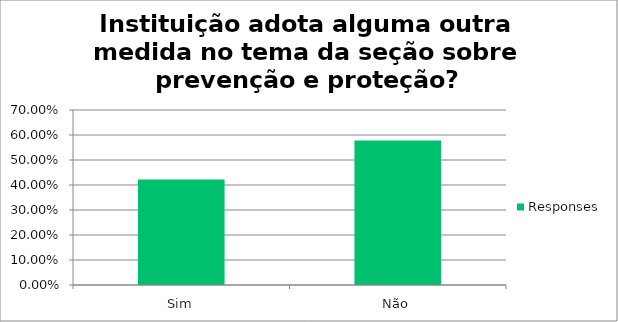
| Category | Responses |
|---|---|
| Sim | 0.422 |
| Não | 0.578 |